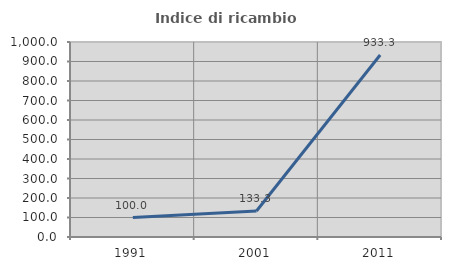
| Category | Indice di ricambio occupazionale  |
|---|---|
| 1991.0 | 100 |
| 2001.0 | 133.333 |
| 2011.0 | 933.333 |